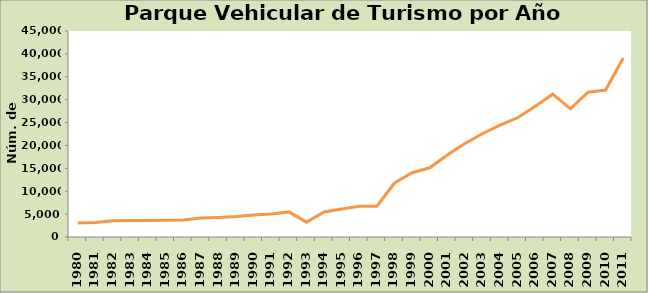
| Category | Series 0 |
|---|---|
| 1980.0 | 3070 |
| 1981.0 | 3150 |
| 1982.0 | 3550 |
| 1983.0 | 3589 |
| 1984.0 | 3596 |
| 1985.0 | 3674 |
| 1986.0 | 3718 |
| 1987.0 | 4127 |
| 1988.0 | 4266 |
| 1989.0 | 4476 |
| 1990.0 | 4782 |
| 1991.0 | 5005 |
| 1992.0 | 5481 |
| 1993.0 | 3240 |
| 1994.0 | 5476 |
| 1995.0 | 6137 |
| 1996.0 | 6706 |
| 1997.0 | 6729 |
| 1998.0 | 11793 |
| 1999.0 | 14048 |
| 2000.0 | 15124 |
| 2001.0 | 17889 |
| 2002.0 | 20424 |
| 2003.0 | 22561 |
| 2004.0 | 24419 |
| 2005.0 | 26044 |
| 2006.0 | 28579 |
| 2007.0 | 31203 |
| 2008.0 | 28008 |
| 2009.0 | 31619 |
| 2010.0 | 32105 |
| 2011.0 | 39093 |